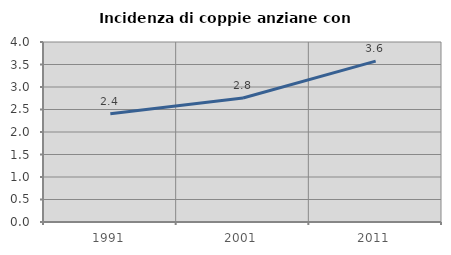
| Category | Incidenza di coppie anziane con figli |
|---|---|
| 1991.0 | 2.403 |
| 2001.0 | 2.756 |
| 2011.0 | 3.575 |